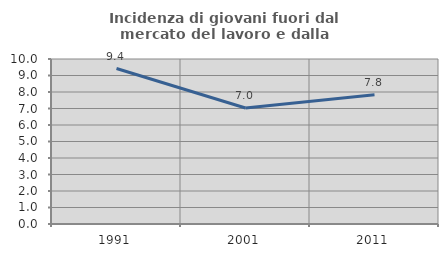
| Category | Incidenza di giovani fuori dal mercato del lavoro e dalla formazione  |
|---|---|
| 1991.0 | 9.422 |
| 2001.0 | 7.03 |
| 2011.0 | 7.828 |